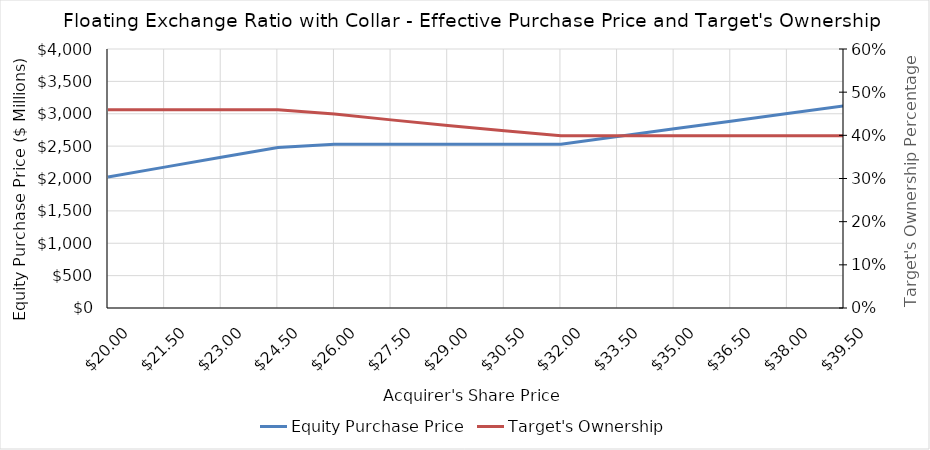
| Category | Equity Purchase Price |
|---|---|
| 20.0 | 2023.668 |
| 21.5 | 2175.443 |
| 23.0 | 2327.218 |
| 24.5 | 2478.993 |
| 26.0 | 2529.585 |
| 27.5 | 2529.585 |
| 29.0 | 2529.585 |
| 30.5 | 2529.585 |
| 32.0 | 2529.585 |
| 33.5 | 2648.159 |
| 35.0 | 2766.733 |
| 36.5 | 2885.307 |
| 38.0 | 3003.882 |
| 39.5 | 3122.456 |